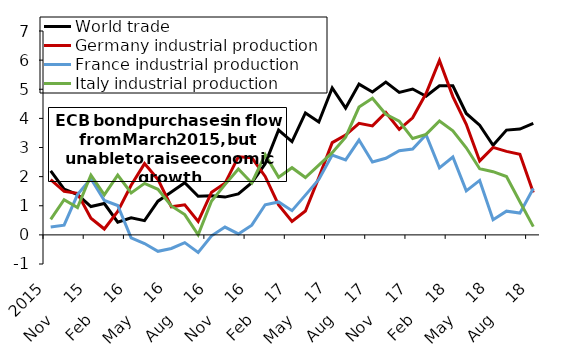
| Category | World trade | Germany industrial production | France industrial production | Italy industrial production |
|---|---|---|---|---|
| Aug     2015 | 2.2 | 1.901 | 0.267 | 0.534 |
| Sep     15 | 1.57 | 1.492 | 0.335 | 1.208 |
| Oct     15 | 1.384 | 1.428 | 1.381 | 0.94 |
| Nov     15 | 0.974 | 0.573 | 1.932 | 2.055 |
| Dec     15 | 1.077 | 0.201 | 1.182 | 1.378 |
| Jan     16 | 0.436 | 0.804 | 1.008 | 2.05 |
| Feb     16 | 0.584 | 1.706 | -0.1 | 1.438 |
| Mar     16 | 0.487 | 2.447 | -0.299 | 1.768 |
| Apr     16 | 1.158 | 1.904 | -0.565 | 1.564 |
| May     16 | 1.468 | 0.966 | -0.466 | 0.994 |
| Jun     16 | 1.79 | 1.032 | -0.267 | 0.696 |
| Jul     16 | 1.327 | 0.464 | -0.6 | 0 |
| Aug     16 | 1.346 | 1.466 | -0.033 | 1.162 |
| Sep     16 | 1.297 | 1.77 | 0.267 | 1.725 |
| Oct     16 | 1.407 | 2.682 | 0.033 | 2.261 |
| Nov     16 | 1.791 | 2.649 | 0.332 | 1.782 |
| Dec     16 | 2.437 | 2.007 | 1.035 | 2.751 |
| Jan     17 | 3.599 | 1.03 | 1.131 | 1.976 |
| Feb     17 | 3.204 | 0.46 | 0.832 | 2.307 |
| Mar     17 | 4.185 | 0.818 | 1.364 | 1.967 |
| Apr     17 | 3.873 | 1.967 | 1.906 | 2.392 |
| May     17 | 5.047 | 3.167 | 2.742 | 2.822 |
| Jun     17 | 4.354 | 3.427 | 2.574 | 3.355 |
| Jul     17 | 5.177 | 3.831 | 3.255 | 4.388 |
| Aug     17 | 4.905 | 3.743 | 2.502 | 4.693 |
| Sep     17 | 5.245 | 4.201 | 2.63 | 4.141 |
| Oct     17 | 4.893 | 3.624 | 2.889 | 3.901 |
| Nov     17 | 5.009 | 4.018 | 2.949 | 3.307 |
| Dec     17 | 4.759 | 4.854 | 3.437 | 3.452 |
| Jan     18 | 5.12 | 5.987 | 2.302 | 3.908 |
| Feb     18 | 5.118 | 4.746 | 2.673 | 3.576 |
| Mar     18 | 4.168 | 3.797 | 1.51 | 2.99 |
| Apr     18 | 3.768 | 2.54 | 1.87 | 2.272 |
| May     18 | 3.075 | 3.006 | 0.521 | 2.17 |
| Jun     18 | 3.596 | 2.867 | 0.815 | 2.005 |
| Jul     18 | 3.631 | 2.767 | 0.747 | 1.138 |
| Aug     18 | 3.829 | 1.456 | 1.595 | 0.282 |